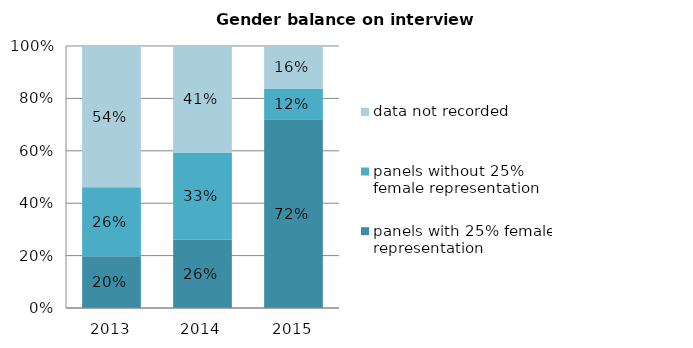
| Category | panels with 25% female representation | panels without 25% female representation | data not recorded |
|---|---|---|---|
| 2013.0 | 0.197 | 0.263 | 0.539 |
| 2014.0 | 0.26 | 0.333 | 0.406 |
| 2015.0 | 0.721 | 0.118 | 0.162 |